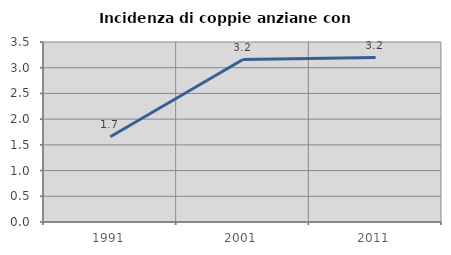
| Category | Incidenza di coppie anziane con figli |
|---|---|
| 1991.0 | 1.657 |
| 2001.0 | 3.159 |
| 2011.0 | 3.197 |